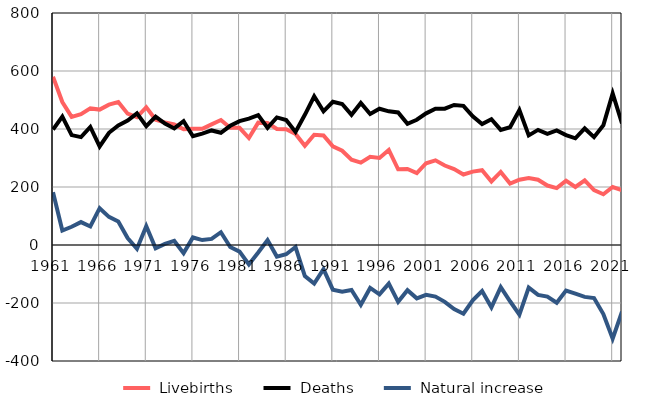
| Category |  Livebirths |  Deaths |  Natural increase |
|---|---|---|---|
| 1961.0 | 580 | 398 | 182 |
| 1962.0 | 493 | 443 | 50 |
| 1963.0 | 442 | 379 | 63 |
| 1964.0 | 451 | 372 | 79 |
| 1965.0 | 471 | 407 | 64 |
| 1966.0 | 467 | 340 | 127 |
| 1967.0 | 484 | 387 | 97 |
| 1968.0 | 493 | 412 | 81 |
| 1969.0 | 453 | 429 | 24 |
| 1970.0 | 441 | 454 | -13 |
| 1971.0 | 475 | 410 | 65 |
| 1972.0 | 432 | 443 | -11 |
| 1973.0 | 423 | 419 | 4 |
| 1974.0 | 416 | 402 | 14 |
| 1975.0 | 399 | 427 | -28 |
| 1976.0 | 401 | 375 | 26 |
| 1977.0 | 401 | 384 | 17 |
| 1978.0 | 416 | 395 | 21 |
| 1979.0 | 431 | 387 | 44 |
| 1980.0 | 404 | 411 | -7 |
| 1981.0 | 404 | 427 | -23 |
| 1982.0 | 369 | 436 | -67 |
| 1983.0 | 422 | 448 | -26 |
| 1984.0 | 421 | 404 | 17 |
| 1985.0 | 400 | 440 | -40 |
| 1986.0 | 399 | 431 | -32 |
| 1987.0 | 383 | 390 | -7 |
| 1988.0 | 342 | 449 | -107 |
| 1989.0 | 380 | 513 | -133 |
| 1990.0 | 378 | 461 | -83 |
| 1991.0 | 340 | 494 | -154 |
| 1992.0 | 325 | 486 | -161 |
| 1993.0 | 294 | 449 | -155 |
| 1994.0 | 284 | 490 | -206 |
| 1995.0 | 304 | 452 | -148 |
| 1996.0 | 300 | 470 | -170 |
| 1997.0 | 328 | 461 | -133 |
| 1998.0 | 261 | 457 | -196 |
| 1999.0 | 262 | 418 | -156 |
| 2000.0 | 248 | 432 | -184 |
| 2001.0 | 282 | 454 | -172 |
| 2002.0 | 292 | 470 | -178 |
| 2003.0 | 274 | 470 | -196 |
| 2004.0 | 262 | 483 | -221 |
| 2005.0 | 243 | 480 | -237 |
| 2006.0 | 253 | 444 | -191 |
| 2007.0 | 258 | 417 | -159 |
| 2008.0 | 219 | 434 | -215 |
| 2009.0 | 252 | 397 | -145 |
| 2010.0 | 212 | 406 | -194 |
| 2011.0 | 225 | 465 | -240 |
| 2012.0 | 231 | 378 | -147 |
| 2013.0 | 225 | 397 | -172 |
| 2014.0 | 205 | 383 | -178 |
| 2015.0 | 196 | 395 | -199 |
| 2016.0 | 222 | 379 | -157 |
| 2017.0 | 200 | 368 | -168 |
| 2018.0 | 223 | 402 | -179 |
| 2019.0 | 189 | 372 | -183 |
| 2020.0 | 175 | 413 | -238 |
| 2021.0 | 200 | 523 | -323 |
| 2022.0 | 189 | 419 | -230 |